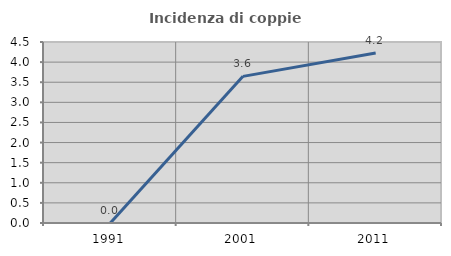
| Category | Incidenza di coppie miste |
|---|---|
| 1991.0 | 0 |
| 2001.0 | 3.646 |
| 2011.0 | 4.229 |